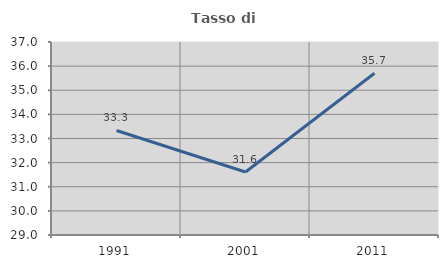
| Category | Tasso di occupazione   |
|---|---|
| 1991.0 | 33.333 |
| 2001.0 | 31.612 |
| 2011.0 | 35.703 |